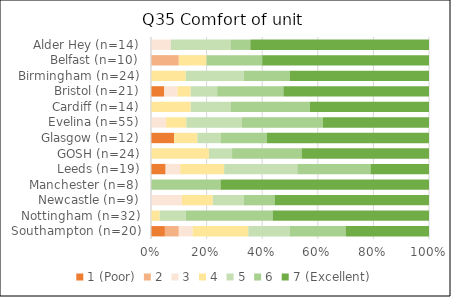
| Category | 1 (Poor) | 2 | 3 | 4 | 5 | 6 | 7 (Excellent) |
|---|---|---|---|---|---|---|---|
| Southampton (n=20) | 1 | 1 | 1 | 4 | 3 | 4 | 6 |
| Nottingham (n=32) | 0 | 0 | 0 | 1 | 3 | 10 | 18 |
| Newcastle (n=9) | 0 | 0 | 1 | 1 | 1 | 1 | 5 |
| Manchester (n=8) | 0 | 0 | 0 | 0 | 0 | 2 | 6 |
| Leeds (n=19) | 1 | 0 | 1 | 3 | 5 | 5 | 4 |
| GOSH (n=24) | 0 | 0 | 0 | 5 | 2 | 6 | 11 |
| Glasgow (n=12) | 1 | 0 | 0 | 1 | 1 | 2 | 7 |
| Evelina (n=55) | 0 | 0 | 3 | 4 | 11 | 16 | 21 |
| Cardiff (n=14) | 0 | 0 | 0 | 2 | 2 | 4 | 6 |
| Bristol (n=21) | 1 | 0 | 1 | 1 | 2 | 5 | 11 |
| Birmingham (n=24) | 0 | 0 | 0 | 3 | 5 | 4 | 12 |
| Belfast (n=10) | 0 | 1 | 0 | 1 | 0 | 2 | 6 |
| Alder Hey (n=14) | 0 | 0 | 1 | 0 | 3 | 1 | 9 |